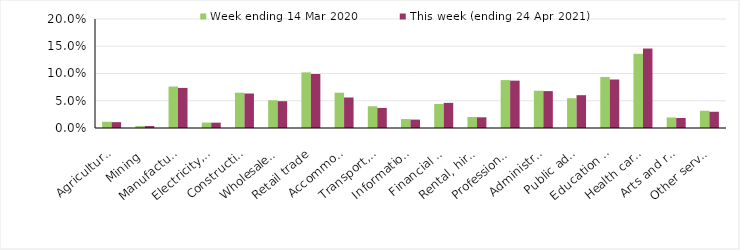
| Category | Week ending 14 Mar 2020 | This week (ending 24 Apr 2021) |
|---|---|---|
| Agriculture, forestry and fishing | 0.012 | 0.011 |
| Mining | 0.004 | 0.004 |
| Manufacturing | 0.076 | 0.074 |
| Electricity, gas, water and waste services | 0.01 | 0.01 |
| Construction | 0.065 | 0.063 |
| Wholesale trade | 0.051 | 0.049 |
| Retail trade | 0.102 | 0.099 |
| Accommodation and food services | 0.065 | 0.056 |
| Transport, postal and warehousing | 0.04 | 0.037 |
| Information media and telecommunications | 0.016 | 0.015 |
| Financial and insurance services | 0.044 | 0.046 |
| Rental, hiring and real estate services | 0.02 | 0.02 |
| Professional, scientific and technical services | 0.088 | 0.087 |
| Administrative and support services | 0.068 | 0.068 |
| Public administration and safety | 0.055 | 0.06 |
| Education and training | 0.094 | 0.089 |
| Health care and social assistance | 0.136 | 0.146 |
| Arts and recreation services | 0.019 | 0.018 |
| Other services | 0.032 | 0.03 |